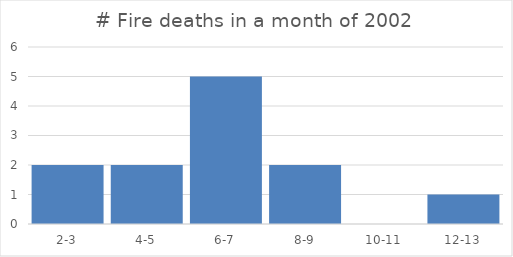
| Category | Series 0 |
|---|---|
| 2-3 | 2 |
| 4-5 | 2 |
| 6-7 | 5 |
| 8-9 | 2 |
| 10-11 | 0 |
| 12-13 | 1 |